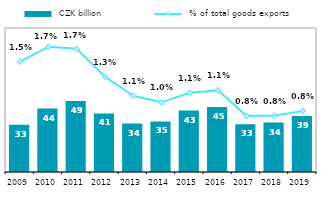
| Category |  CZK billion |
|---|---|
| 2009.0 | 32.812 |
| 2010.0 | 44.08 |
| 2011.0 | 49.246 |
| 2012.0 | 40.656 |
| 2013.0 | 33.61 |
| 2014.0 | 35.112 |
| 2015.0 | 42.707 |
| 2016.0 | 45.144 |
| 2017.0 | 33.101 |
| 2018.0 | 34.371 |
| 2019.0 | 38.808 |